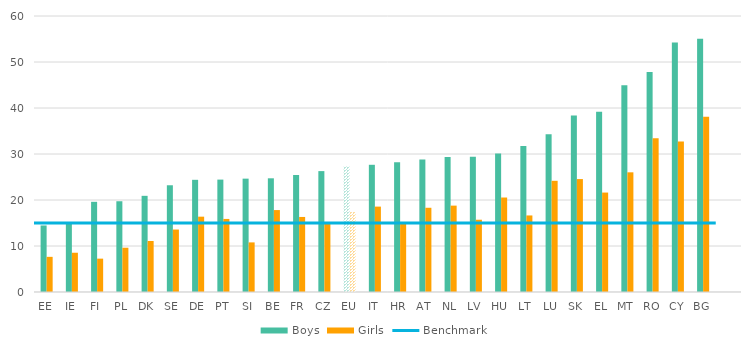
| Category | Boys | Girls |
|---|---|---|
| 0 | 14.462 | 7.644 |
| 1 | 15.1 | 8.536 |
| 2 | 19.603 | 7.252 |
| 3 | 19.73 | 9.626 |
| 4 | 20.907 | 11.083 |
| 5 | 23.204 | 13.578 |
| 6 | 24.389 | 16.376 |
| 7 | 24.436 | 15.884 |
| 8 | 24.643 | 10.784 |
| 9 | 24.718 | 17.811 |
| 10 | 25.437 | 16.314 |
| 11 | 26.28 | 14.952 |
| 12 | 27.297 | 17.379 |
| 13 | 27.654 | 18.564 |
| 14 | 28.22 | 15.025 |
| 15 | 28.779 | 18.31 |
| 16 | 29.367 | 18.779 |
| 17 | 29.387 | 15.711 |
| 18 | 30.097 | 20.54 |
| 19 | 31.753 | 16.642 |
| 20 | 34.268 | 24.174 |
| 21 | 38.366 | 24.549 |
| 22 | 39.165 | 21.617 |
| 23 | 44.941 | 26.016 |
| 24 | 47.81 | 33.433 |
| 25 | 54.26 | 32.742 |
| 26 | 55.077 | 38.08 |